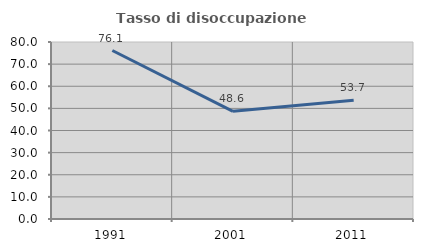
| Category | Tasso di disoccupazione giovanile  |
|---|---|
| 1991.0 | 76.147 |
| 2001.0 | 48.649 |
| 2011.0 | 53.704 |